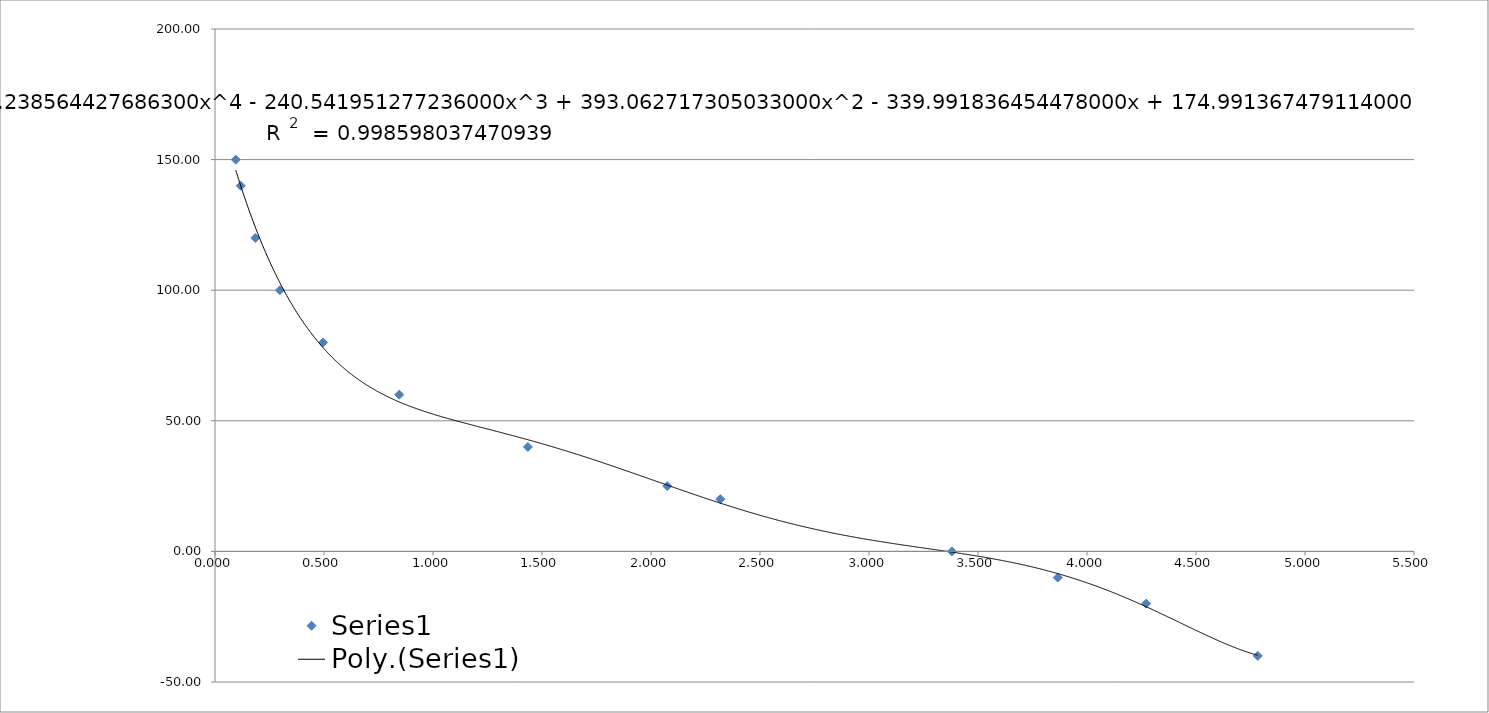
| Category | Series 0 |
|---|---|
| 4.783315049779562 | -40 |
| 4.271270718232043 | -20 |
| 3.865830442849076 | -10 |
| 3.380125899280575 | 0 |
| 2.318181818181818 | 20 |
| 2.074490804824995 | 25 |
| 1.435329341317365 | 40 |
| 0.845272525027809 | 60 |
| 0.495726752934096 | 80 |
| 0.29774011299435 | 100 |
| 0.185126887247029 | 120 |
| 0.117909475740801 | 140 |
| 0.0950932286555446 | 150 |